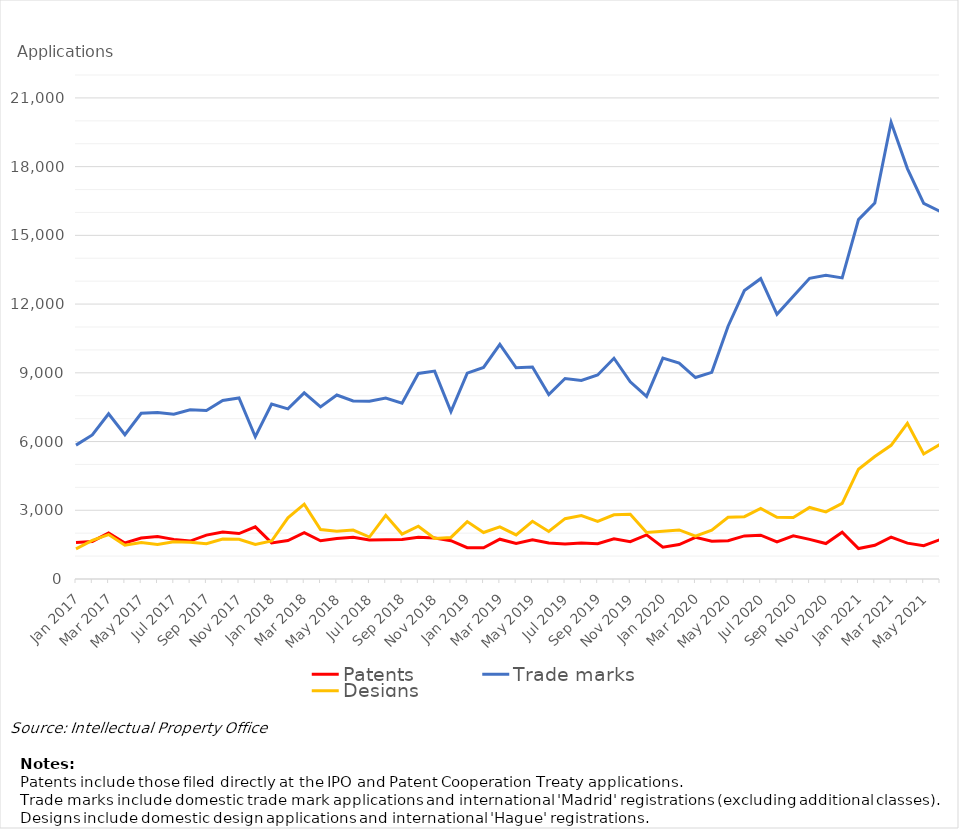
| Category | Patents | Trade marks | Designs |
|---|---|---|---|
| Jan 2017 | 1596 | 5843 | 1318 |
| Feb 2017 | 1640 | 6288 | 1687 |
| Mar 2017 | 2011 | 7214 | 1940 |
| Apr 2017 | 1573 | 6297 | 1474 |
| May 2017 | 1790 | 7234 | 1592 |
| Jun 2017 | 1853 | 7263 | 1502 |
| Jul 2017 | 1730 | 7197 | 1627 |
| Aug 2017 | 1657 | 7389 | 1600 |
| Sep 2017 | 1915 | 7359 | 1544 |
| Oct 2017 | 2055 | 7792 | 1745 |
| Nov 2017 | 1983 | 7901 | 1736 |
| Dec 2017 | 2277 | 6211 | 1507 |
| Jan 2018 | 1575 | 7634 | 1658 |
| Feb 2018 | 1676 | 7428 | 2672 |
| Mar 2018 | 2022 | 8127 | 3267 |
| Apr 2018 | 1670 | 7512 | 2160 |
| May 2018 | 1767 | 8030 | 2083 |
| Jun 2018 | 1821 | 7769 | 2136 |
| Jul 2018 | 1704 | 7757 | 1832 |
| Aug 2018 | 1713 | 7897 | 2777 |
| Sep 2018 | 1725 | 7673 | 1960 |
| Oct 2018 | 1818 | 8972 | 2302 |
| Nov 2018 | 1787 | 9076 | 1765 |
| Dec 2018 | 1670 | 7304 | 1815 |
| Jan 2019 | 1367 | 8984 | 2505 |
| Feb 2019 | 1361 | 9234 | 2031 |
| Mar 2019 | 1737 | 10243 | 2274 |
| Apr 2019 | 1552 | 9219 | 1923 |
| May 2019 | 1710 | 9251 | 2520 |
| Jun 2019 | 1569 | 8053 | 2074 |
| Jul 2019 | 1527 | 8752 | 2634 |
| Aug 2019 | 1571 | 8670 | 2768 |
| Sep 2019 | 1540 | 8907 | 2511 |
| Oct 2019 | 1755 | 9636 | 2800 |
| Nov 2019 | 1630 | 8607 | 2827 |
| Dec 2019 | 1926 | 7970 | 2028 |
| Jan 2020 | 1392 | 9642 | 2082 |
| Feb 2020 | 1506 | 9428 | 2143 |
| Mar 2020 | 1819 | 8794 | 1871 |
| Apr 2020 | 1648 | 9021 | 2127 |
| May 2020 | 1671 | 11035 | 2694 |
| Jun 2020 | 1880 | 12593 | 2721 |
| Jul 2020 | 1911 | 13110 | 3085 |
| Aug 2020 | 1616 | 11551 | 2694 |
| Sep 2020 | 1886 | 12340 | 2686 |
| Oct 2020 | 1731 | 13126 | 3124 |
| Nov 2020 | 1548 | 13254 | 2930 |
| Dec 2020 | 2043 | 13143 | 3303 |
| Jan 2021 | 1330 | 15686 | 4792 |
| Feb 2021 | 1472 | 16412 | 5347 |
| Mar 2021 | 1831 | 19936 | 5836 |
| Apr 2021 | 1565 | 17914 | 6794 |
| May 2021 | 1455 | 16398 | 5458 |
| June 2021 | 1719 | 16049 | 5880 |